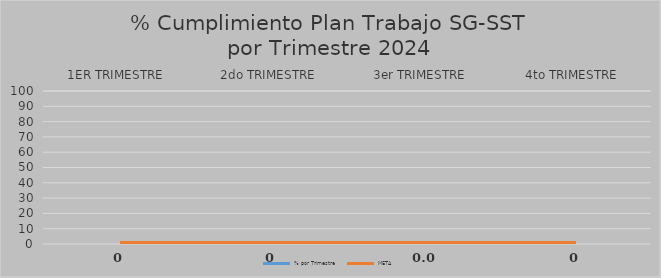
| Category | % por Trimestre  | META |
|---|---|---|
| 1ER TRIMESTRE  | 0 | 0.95 |
| 2do TRIMESTRE  | 0 | 0.95 |
| 3er TRIMESTRE  | 0 | 0.95 |
| 4to TRIMESTRE  | 0 | 0.95 |